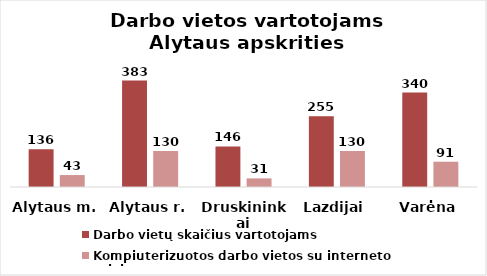
| Category | Darbo vietų skaičius vartotojams | Kompiuterizuotos darbo vietos su interneto prieiga |
|---|---|---|
| Alytaus m. | 136 | 43 |
| Alytaus r. | 383 | 130 |
| Druskininkai | 146 | 31 |
| Lazdijai | 255 | 130 |
| Varėna | 340 | 91 |